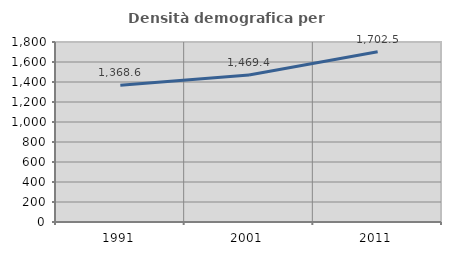
| Category | Densità demografica |
|---|---|
| 1991.0 | 1368.625 |
| 2001.0 | 1469.401 |
| 2011.0 | 1702.541 |